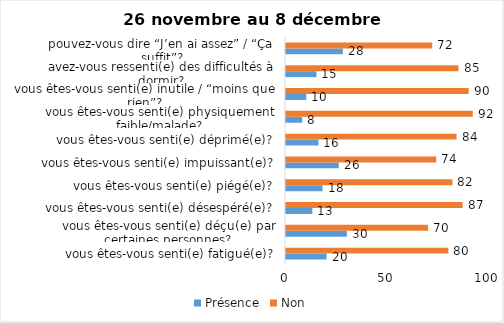
| Category | Présence | Non |
|---|---|---|
| vous êtes-vous senti(e) fatigué(e)? | 20 | 80 |
| vous êtes-vous senti(e) déçu(e) par certaines personnes? | 30 | 70 |
| vous êtes-vous senti(e) désespéré(e)? | 13 | 87 |
| vous êtes-vous senti(e) piégé(e)? | 18 | 82 |
| vous êtes-vous senti(e) impuissant(e)? | 26 | 74 |
| vous êtes-vous senti(e) déprimé(e)? | 16 | 84 |
| vous êtes-vous senti(e) physiquement faible/malade? | 8 | 92 |
| vous êtes-vous senti(e) inutile / “moins que rien”? | 10 | 90 |
| avez-vous ressenti(e) des difficultés à dormir? | 15 | 85 |
| pouvez-vous dire “J’en ai assez” / “Ça suffit”? | 28 | 72 |